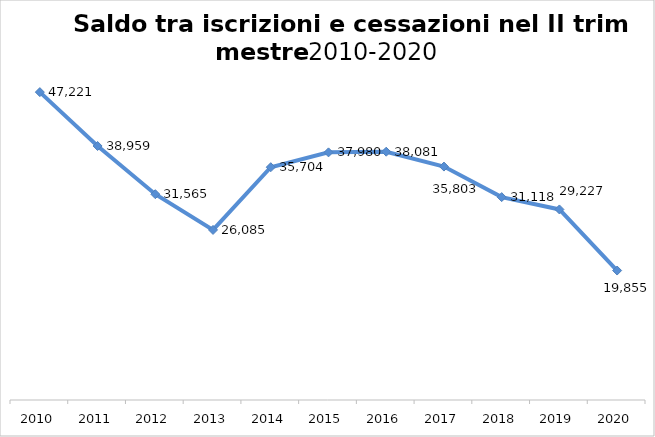
| Category | SALDO |
|---|---|
| 2010.0 | 47221 |
| 2011.0 | 38959 |
| 2012.0 | 31565 |
| 2013.0 | 26085 |
| 2014.0 | 35704 |
| 2015.0 | 37980 |
| 2016.0 | 38081 |
| 2017.0 | 35803 |
| 2018.0 | 31118 |
| 2019.0 | 29227 |
| 2020.0 | 19855 |